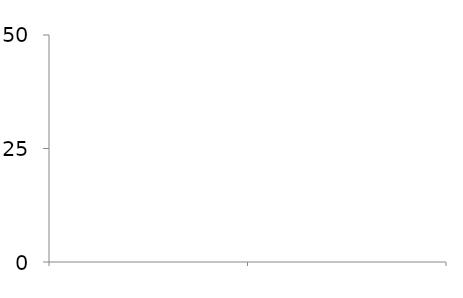
| Category | Series 0 |
|---|---|
|  | 0 |
|  | 0 |